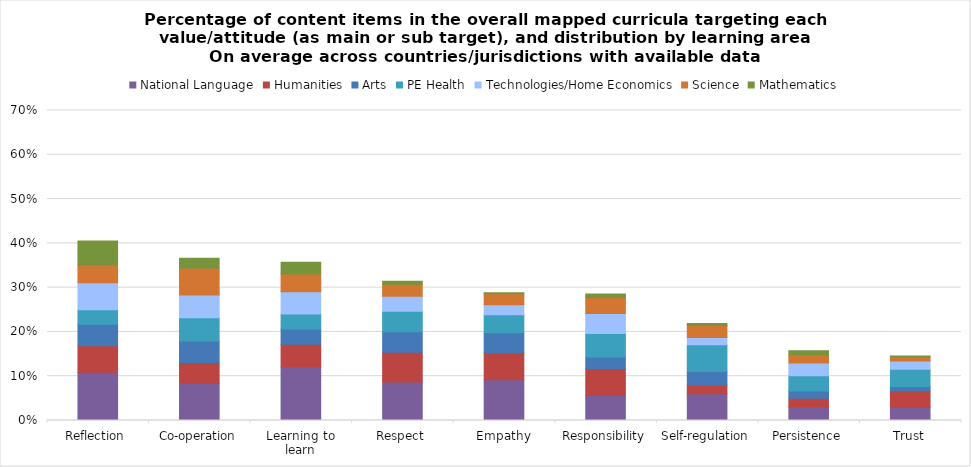
| Category | National Language | Humanities | Arts | PE Health | Technologies/Home Economics | Science | Mathematics |
|---|---|---|---|---|---|---|---|
| Reflection | 0.109 | 0.06 | 0.048 | 0.033 | 0.061 | 0.04 | 0.054 |
| Co-operation | 0.084 | 0.047 | 0.049 | 0.053 | 0.051 | 0.061 | 0.022 |
| Learning to learn | 0.121 | 0.051 | 0.034 | 0.034 | 0.05 | 0.04 | 0.027 |
| Respect | 0.087 | 0.067 | 0.046 | 0.046 | 0.034 | 0.028 | 0.006 |
| Empathy | 0.092 | 0.061 | 0.045 | 0.04 | 0.023 | 0.025 | 0.002 |
| Responsibility | 0.057 | 0.061 | 0.026 | 0.053 | 0.045 | 0.036 | 0.008 |
| Self-regulation | 0.061 | 0.019 | 0.031 | 0.06 | 0.017 | 0.027 | 0.004 |
| Persistence | 0.031 | 0.02 | 0.016 | 0.035 | 0.029 | 0.018 | 0.009 |
| Trust | 0.03 | 0.037 | 0.01 | 0.039 | 0.019 | 0.009 | 0.002 |